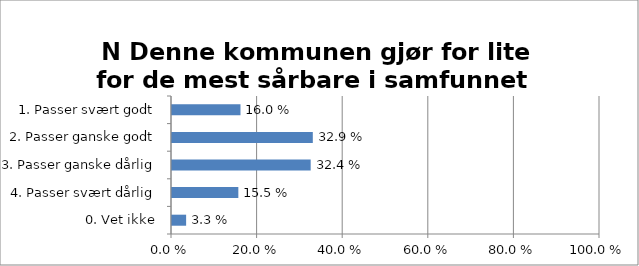
| Category | 
N Denne kommunen gjør for lite for de mest sårbare i samfunnet  |
|---|---|
| 1. Passer svært godt | 0.16 |
| 2. Passer ganske godt | 0.329 |
| 3. Passer ganske dårlig | 0.324 |
| 4. Passer svært dårlig | 0.155 |
| 0. Vet ikke | 0.033 |